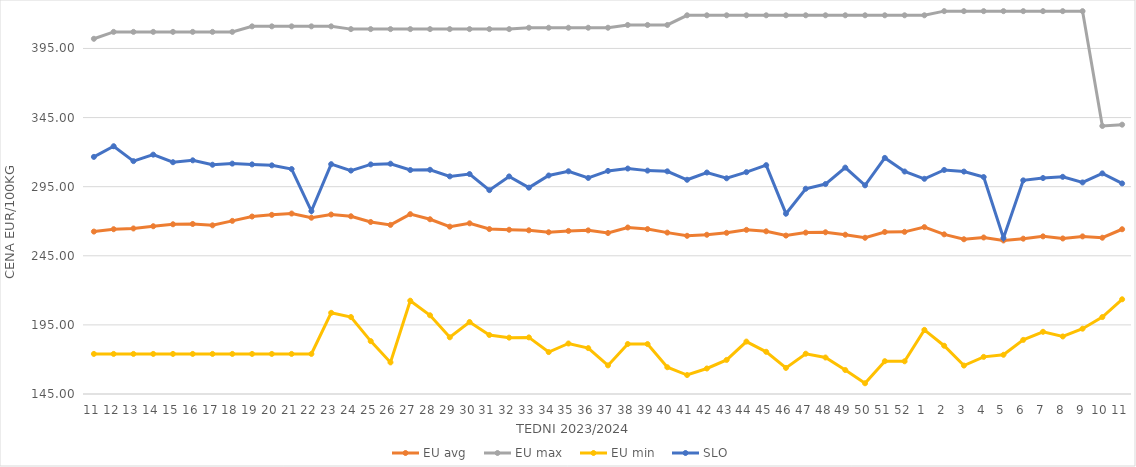
| Category | EU avg | EU max | EU min | SLO |
|---|---|---|---|---|
| 11.0 | 262.513 | 402 | 174 | 316.55 |
| 12.0 | 264.228 | 407 | 174 | 324.27 |
| 13.0 | 264.768 | 407 | 174 | 313.49 |
| 14.0 | 266.385 | 407 | 174 | 318.17 |
| 15.0 | 267.797 | 407 | 174 | 312.7 |
| 16.0 | 268.021 | 407 | 174 | 314.07 |
| 17.0 | 267.041 | 407 | 174 | 310.87 |
| 18.0 | 270.255 | 407 | 174 | 311.69 |
| 19.0 | 273.406 | 411 | 174 | 311.13 |
| 20.0 | 274.631 | 411 | 174 | 310.42 |
| 21.0 | 275.561 | 411 | 174 | 307.76 |
| 22.0 | 272.542 | 411 | 174 | 277.34 |
| 23.0 | 274.85 | 411 | 203.728 | 311.28 |
| 24.0 | 273.59 | 409 | 200.686 | 306.64 |
| 25.0 | 269.439 | 409 | 183.275 | 311.1 |
| 26.0 | 267.345 | 409 | 167.858 | 311.62 |
| 27.0 | 275.123 | 409 | 212.506 | 307.04 |
| 28.0 | 271.42 | 409 | 201.945 | 307.23 |
| 29.0 | 266.08 | 409 | 186.018 | 302.45 |
| 30.0 | 268.49 | 409 | 197.093 | 304.14 |
| 31.0 | 264.334 | 409 | 187.684 | 292.49 |
| 32.0 | 263.844 | 409 | 185.774 | 302.41 |
| 33.0 | 263.441 | 410 | 185.951 | 294.3 |
| 34.0 | 262.028 | 410 | 175.332 | 303.1 |
| 35.0 | 262.997 | 410 | 181.543 | 306.13 |
| 36.0 | 263.389 | 410 | 178.207 | 301.32 |
| 37.0 | 261.486 | 410 | 165.697 | 306.4 |
| 38.0 | 265.47 | 412 | 181.159 | 308.12 |
| 39.0 | 264.316 | 412 | 181.124 | 306.62 |
| 40.0 | 261.774 | 412 | 164.37 | 306.1 |
| 41.0 | 259.456 | 419 | 158.728 | 300 |
| 42.0 | 260.21 | 419 | 163.464 | 305.24 |
| 43.0 | 261.605 | 419 | 169.66 | 301.07 |
| 44.0 | 263.758 | 419 | 182.925 | 305.52 |
| 45.0 | 262.714 | 419 | 175.524 | 310.58 |
| 46.0 | 259.625 | 419 | 163.882 | 275.46 |
| 47.0 | 261.772 | 419 | 174.136 | 293.51 |
| 48.0 | 262.018 | 419 | 171.4 | 296.9 |
| 49.0 | 260.246 | 419 | 162.336 | 308.8 |
| 50.0 | 258.042 | 419 | 152.762 | 295.97 |
| 51.0 | 262.231 | 419 | 168.739 | 315.82 |
| 52.0 | 262.325 | 419 | 168.659 | 305.97 |
| 1.0 | 265.728 | 419 | 191.406 | 300.71 |
| 2.0 | 260.513 | 422 | 179.926 | 307.09 |
| 3.0 | 256.954 | 422 | 165.575 | 305.92 |
| 4.0 | 258.235 | 422 | 171.865 | 301.97 |
| 5.0 | 256.09 | 422 | 173.378 | 257.83 |
| 6.0 | 257.376 | 422 | 184.141 | 299.57 |
| 7.0 | 259.042 | 422 | 190.004 | 301.25 |
| 8.0 | 257.531 | 422 | 186.634 | 302.13 |
| 9.0 | 259.029 | 422 | 192.26 | 298.07 |
| 10.0 | 258.07 | 338.92 | 200.67 | 304.62 |
| 11.0 | 264.201 | 339.86 | 213.526 | 297.35 |